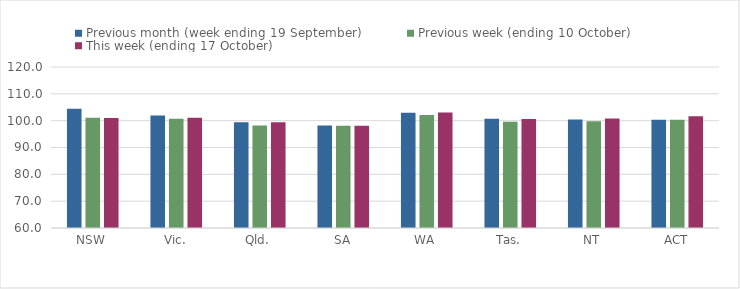
| Category | Previous month (week ending 19 September) | Previous week (ending 10 October) | This week (ending 17 October) |
|---|---|---|---|
| NSW | 104.47 | 101.11 | 100.98 |
| Vic. | 101.91 | 100.75 | 101.09 |
| Qld. | 99.4 | 98.18 | 99.38 |
| SA | 98.2 | 98.15 | 98.15 |
| WA | 102.92 | 102.15 | 103.07 |
| Tas. | 100.71 | 99.6 | 100.66 |
| NT | 100.48 | 99.76 | 100.77 |
| ACT | 100.35 | 100.35 | 101.64 |